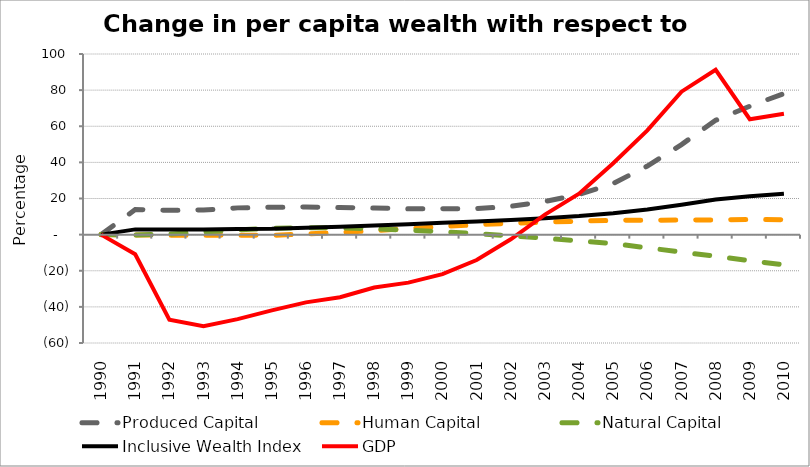
| Category | Produced Capital  | Human Capital | Natural Capital | Inclusive Wealth Index | GDP |
|---|---|---|---|---|---|
| 1990.0 | 0 | 0 | 0 | 0 | 0 |
| 1991.0 | 13.851 | -0.198 | -0.263 | 2.898 | -10.858 |
| 1992.0 | 13.479 | -0.292 | 0.318 | 2.771 | -47.146 |
| 1993.0 | 13.603 | -0.311 | 1.443 | 2.83 | -50.665 |
| 1994.0 | 14.81 | -0.372 | 2.631 | 3.099 | -46.776 |
| 1995.0 | 15.143 | -0.38 | 3.476 | 3.201 | -41.919 |
| 1996.0 | 15.254 | 0.322 | 3.819 | 3.758 | -37.504 |
| 1997.0 | 14.998 | 1.212 | 3.719 | 4.355 | -34.659 |
| 1998.0 | 14.743 | 2.191 | 3.23 | 5.002 | -29.308 |
| 1999.0 | 14.282 | 3.324 | 2.492 | 5.707 | -26.571 |
| 2000.0 | 14.282 | 4.484 | 1.614 | 6.528 | -21.871 |
| 2001.0 | 14.361 | 5.49 | 0.571 | 7.246 | -14.084 |
| 2002.0 | 15.667 | 6.288 | -0.658 | 8.074 | -2.592 |
| 2003.0 | 18.338 | 6.927 | -2.027 | 9.079 | 11.064 |
| 2004.0 | 22.187 | 7.465 | -3.478 | 10.266 | 22.643 |
| 2005.0 | 28.339 | 7.906 | -4.966 | 11.889 | 39.496 |
| 2006.0 | 37.966 | 7.973 | -7.303 | 13.966 | 57.707 |
| 2007.0 | 49.862 | 8.1 | -9.647 | 16.589 | 79.137 |
| 2008.0 | 63.303 | 8.155 | -12.001 | 19.499 | 91.278 |
| 2009.0 | 71.123 | 8.377 | -14.374 | 21.291 | 63.898 |
| 2010.0 | 78.11 | 8.277 | -16.771 | 22.661 | 66.95 |